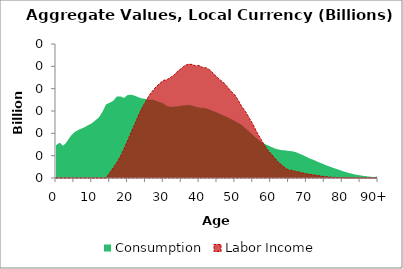
| Category | Consumption | Labor Income |
|---|---|---|
| 0 | 29.274 | 0 |
|  | 31.68 | 0 |
| 2 | 28.823 | 0 |
| 3 | 32.301 | 0 |
| 4 | 37.188 | 0 |
| 5 | 40.637 | 0 |
| 6 | 42.686 | 0 |
| 7 | 44.06 | 0 |
| 8 | 45.484 | 0 |
| 9 | 47.31 | 0 |
| 10 | 48.979 | 0 |
| 11 | 51.595 | 0 |
| 12 | 54.258 | 0 |
| 13 | 59.423 | 0 |
| 14 | 65.879 | 0.082 |
| 15 | 67.394 | 4.448 |
| 16 | 69.169 | 9.074 |
| 17 | 72.97 | 13.733 |
| 18 | 73.048 | 19.354 |
| 19 | 71.716 | 25.817 |
| 20 | 74.294 | 33.132 |
| 21 | 74.606 | 40.848 |
| 22 | 73.733 | 47.848 |
| 23 | 72.349 | 55.505 |
| 24 | 71.256 | 62.434 |
| 25 | 70.87 | 67.859 |
| 26 | 70.187 | 73.821 |
| 27 | 70.147 | 77.962 |
| 28 | 69.04 | 81.726 |
| 29 | 68.055 | 84.641 |
| 30 | 66.823 | 87.389 |
| 31 | 64.433 | 88.03 |
| 32 | 63.743 | 90.038 |
| 33 | 63.885 | 92.093 |
| 34 | 64.09 | 95.706 |
| 35 | 64.75 | 97.943 |
| 36 | 65.229 | 100.716 |
| 37 | 65.323 | 101.871 |
| 38 | 64.912 | 101.712 |
| 39 | 63.934 | 100.393 |
| 40 | 63.083 | 100.681 |
| 41 | 62.814 | 98.997 |
| 42 | 62.332 | 98.625 |
| 43 | 61.137 | 96.71 |
| 44 | 59.919 | 93.608 |
| 45 | 58.641 | 90.336 |
| 46 | 57.153 | 87.58 |
| 47 | 55.626 | 84.919 |
| 48 | 54.341 | 81.226 |
| 49 | 52.606 | 77.469 |
| 50 | 50.937 | 74.349 |
| 51 | 49.281 | 69.118 |
| 52 | 47.198 | 63.566 |
| 53 | 44.355 | 59.399 |
| 54 | 41.627 | 53.702 |
| 55 | 38.571 | 48.361 |
| 56 | 35.848 | 41.841 |
| 57 | 33.161 | 36.156 |
| 58 | 31.139 | 30.881 |
| 59 | 29.568 | 25.785 |
| 60 | 28.038 | 21.925 |
| 61 | 26.654 | 18.31 |
| 62 | 25.656 | 14.63 |
| 63 | 24.993 | 11.821 |
| 64 | 24.766 | 9.16 |
| 65 | 24.151 | 7.209 |
| 66 | 23.986 | 6.762 |
| 67 | 23.143 | 5.9 |
| 68 | 21.905 | 5.29 |
| 69 | 20.497 | 4.449 |
| 70 | 18.905 | 3.739 |
| 71 | 17.422 | 3.192 |
| 72 | 16.2 | 2.743 |
| 73 | 14.725 | 2.23 |
| 74 | 13.455 | 1.762 |
| 75 | 12.111 | 1.239 |
| 76 | 10.835 | 0.967 |
| 77 | 9.639 | 0.685 |
| 78 | 8.533 | 0.508 |
| 79 | 7.446 | 0.398 |
| 80 | 6.3 | 0.239 |
| 81 | 5.282 | 0.138 |
| 82 | 4.386 | 0.104 |
| 83 | 3.575 | 0.074 |
| 84 | 2.849 | 0.048 |
| 85 | 2.376 | 0.032 |
| 86 | 1.88 | 0.018 |
| 87 | 1.455 | 0.011 |
| 88 | 1.097 | 0.006 |
| 89 | 0.801 | 0.003 |
| 90+ | 1.655 | 0.003 |